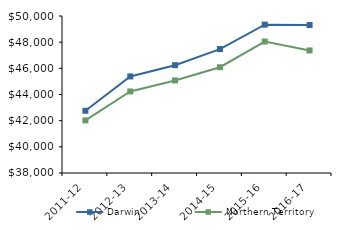
| Category | Darwin | Northern Territory |
|---|---|---|
| 2011-12 | 42757.66 | 42021 |
| 2012-13 | 45382.84 | 44232.02 |
| 2013-14 | 46241 | 45075.51 |
| 2014-15 | 47470.9 | 46083.65 |
| 2015-16 | 49339 | 48046.27 |
| 2016-17 | 49309.4 | 47367.05 |